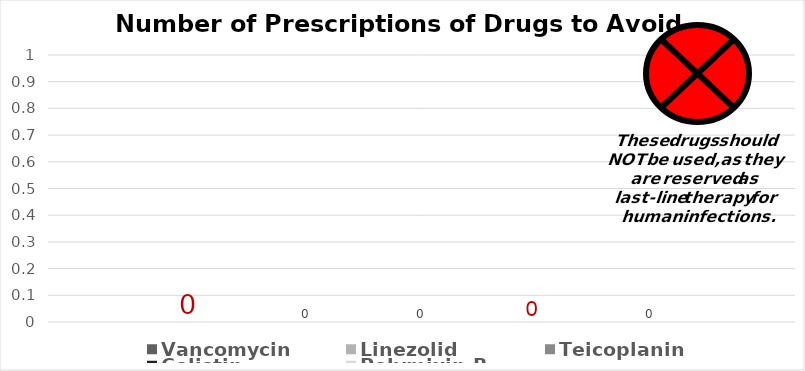
| Category | Vancomycin | Linezolid | Teicoplanin | Colistin | Polymixin B |
|---|---|---|---|---|---|
| Total Prescriptions | 0 | 0 | 0 | 0 | 0 |